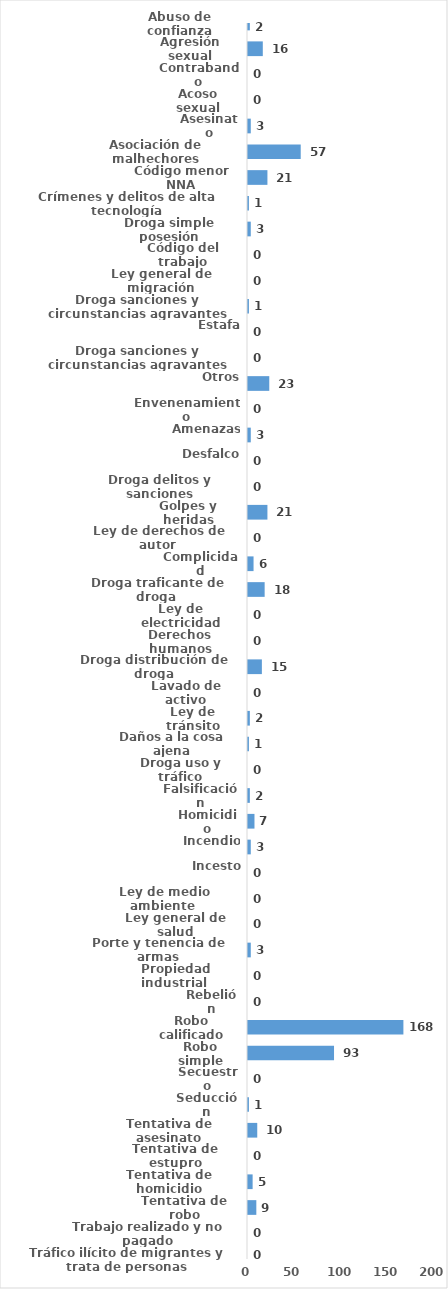
| Category | Series 0 |
|---|---|
| Abuso de confianza | 2 |
| Agresión sexual | 16 |
| Contrabando | 0 |
| Acoso sexual | 0 |
| Asesinato | 3 |
| Asociación de malhechores | 57 |
| Código menor NNA | 21 |
| Crímenes y delitos de alta tecnología | 1 |
| Droga simple posesión | 3 |
| Código del trabajo | 0 |
| Ley general de migración | 0 |
| Droga sanciones y circunstancias agravantes | 1 |
| Estafa | 0 |
| Droga sanciones y circunstancias agravantes | 0 |
| Otros | 23 |
| Envenenamiento | 0 |
| Amenazas | 3 |
| Desfalco | 0 |
| Droga delitos y sanciones | 0 |
| Golpes y heridas | 21 |
| Ley de derechos de autor  | 0 |
| Complicidad | 6 |
| Droga traficante de droga  | 18 |
| Ley de electricidad | 0 |
| Derechos humanos | 0 |
| Droga distribución de droga | 15 |
| Lavado de activo | 0 |
| Ley de tránsito | 2 |
| Daños a la cosa ajena | 1 |
| Droga uso y tráfico | 0 |
| Falsificación | 2 |
| Homicidio | 7 |
| Incendio | 3 |
| Incesto | 0 |
| Ley de medio ambiente  | 0 |
| Ley general de salud | 0 |
| Porte y tenencia de armas | 3 |
| Propiedad industrial  | 0 |
| Rebelión | 0 |
| Robo calificado | 168 |
| Robo simple | 93 |
| Secuestro | 0 |
| Seducción | 1 |
| Tentativa de asesinato | 10 |
| Tentativa de estupro | 0 |
| Tentativa de homicidio | 5 |
| Tentativa de robo | 9 |
| Trabajo realizado y no pagado | 0 |
| Tráfico ilícito de migrantes y trata de personas | 0 |